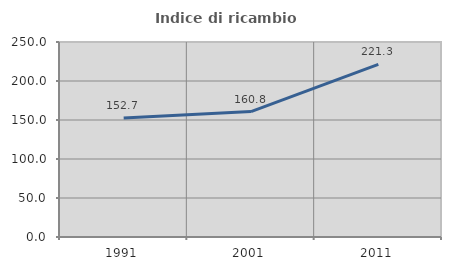
| Category | Indice di ricambio occupazionale  |
|---|---|
| 1991.0 | 152.683 |
| 2001.0 | 160.825 |
| 2011.0 | 221.348 |